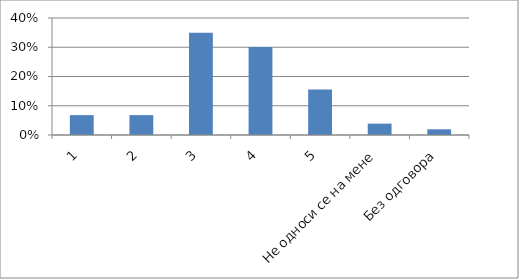
| Category | Series 0 |
|---|---|
| 1 | 0.068 |
| 2 | 0.068 |
| 3 | 0.35 |
| 4 | 0.301 |
| 5 | 0.155 |
| Не односи се на мене | 0.039 |
| Без одговора | 0.019 |